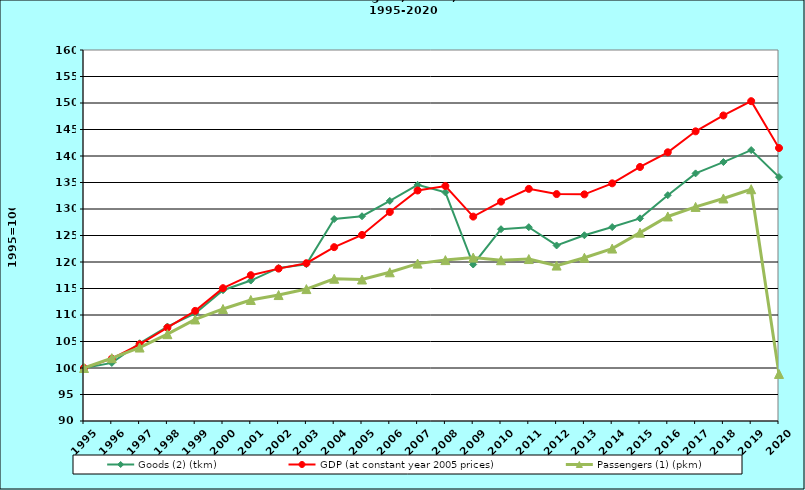
| Category | Goods (2) (tkm) | GDP (at constant year 2005 prices) | Passengers (1) (pkm) |
|---|---|---|---|
| 1995.0 | 100 | 100 | 100 |
| 1996.0 | 100.958 | 101.761 | 101.859 |
| 1997.0 | 104.672 | 104.468 | 103.861 |
| 1998.0 | 107.818 | 107.605 | 106.384 |
| 1999.0 | 110.302 | 110.779 | 109.157 |
| 2000.0 | 114.673 | 115.06 | 111.138 |
| 2001.0 | 116.499 | 117.514 | 112.837 |
| 2002.0 | 118.878 | 118.753 | 113.764 |
| 2003.0 | 119.58 | 119.774 | 114.889 |
| 2004.0 | 128.109 | 122.801 | 116.842 |
| 2005.0 | 128.633 | 125.107 | 116.697 |
| 2006.0 | 131.528 | 129.437 | 118.059 |
| 2007.0 | 134.553 | 133.491 | 119.694 |
| 2008.0 | 133.138 | 134.343 | 120.359 |
| 2009.0 | 119.531 | 128.565 | 120.831 |
| 2010.0 | 126.183 | 131.391 | 120.331 |
| 2011.0 | 126.57 | 133.798 | 120.556 |
| 2012.0 | 123.124 | 132.816 | 119.323 |
| 2013.0 | 125.046 | 132.761 | 120.798 |
| 2014.0 | 126.593 | 134.842 | 122.536 |
| 2015.0 | 128.236 | 137.929 | 125.539 |
| 2016.0 | 132.604 | 140.699 | 128.591 |
| 2017.0 | 136.72 | 144.656 | 130.39 |
| 2018.0 | 138.857 | 147.645 | 131.987 |
| 2019.0 | 141.118 | 150.346 | 133.735 |
| 2020.0 | 136.017 | 141.504 | 98.88 |